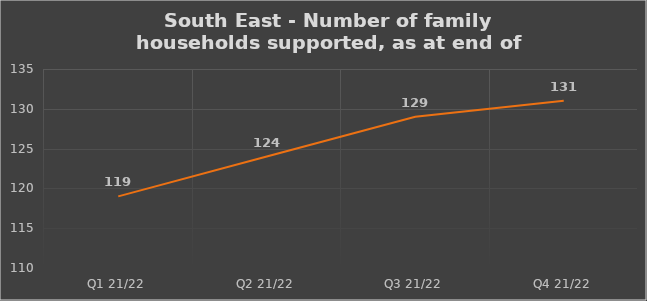
| Category | Number of financially supported households at end of quarter |
|---|---|
| Q1 21/22 | 119 |
| Q2 21/22 | 124 |
| Q3 21/22 | 129 |
| Q4 21/22 | 131 |